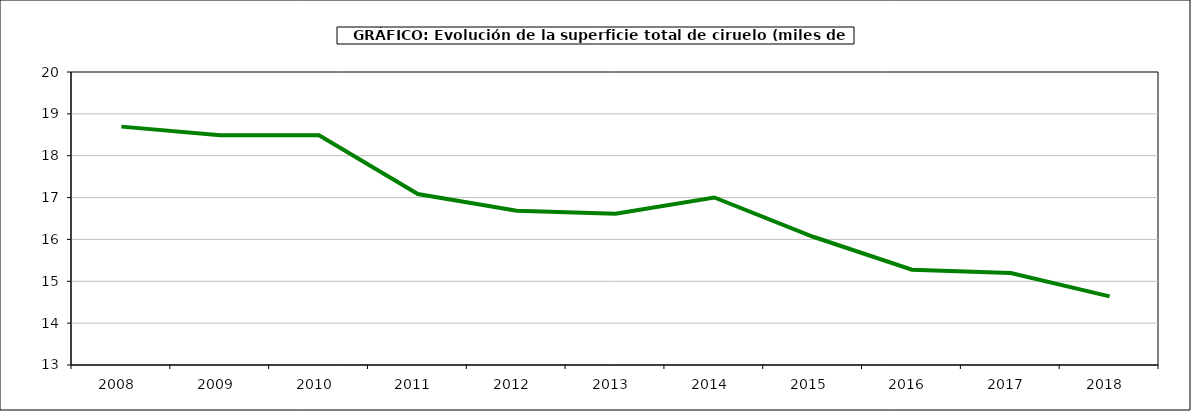
| Category | superficie ciruelo |
|---|---|
| 2008.0 | 18.695 |
| 2009.0 | 18.489 |
| 2010.0 | 18.489 |
| 2011.0 | 17.086 |
| 2012.0 | 16.687 |
| 2013.0 | 16.614 |
| 2014.0 | 17.003 |
| 2015.0 | 16.064 |
| 2016.0 | 15.278 |
| 2017.0 | 15.199 |
| 2018.0 | 14.64 |